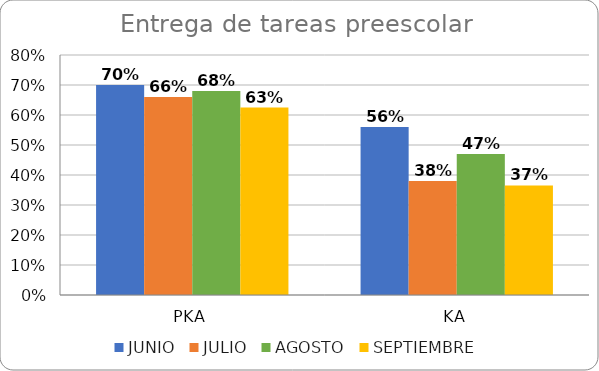
| Category | JUNIO | JULIO | AGOSTO | SEPTIEMBRE |
|---|---|---|---|---|
| PKA | 0.7 | 0.66 | 0.68 | 0.625 |
| KA | 0.56 | 0.38 | 0.47 | 0.365 |